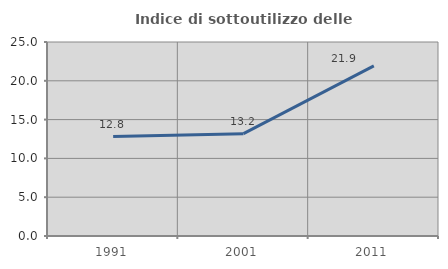
| Category | Indice di sottoutilizzo delle abitazioni  |
|---|---|
| 1991.0 | 12.816 |
| 2001.0 | 13.19 |
| 2011.0 | 21.931 |